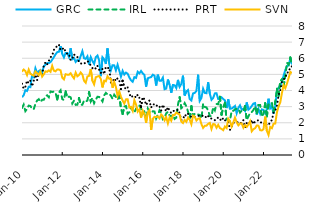
| Category | GRC | IRL | PRT | SVN |
|---|---|---|---|---|
| 2010-01-01 | 3.58 | 2.91 | 4.42 | 5.17 |
| 2010-02-01 | 3.71 | 3.12 | 4.11 | 5.3 |
| 2010-03-01 | 4.02 | 2.72 | 4.24 | 5.21 |
| 2010-04-01 | 3.97 | 2.85 | 4.61 | 4.96 |
| 2010-05-01 | 4.23 | 3.06 | 4.45 | 5.3 |
| 2010-06-01 | 4.21 | 3.04 | 4.61 | 5.04 |
| 2010-07-01 | 4.94 | 2.86 | 4.26 | 4.97 |
| 2010-08-01 | 4.83 | 2.84 | 4.59 | 4.92 |
| 2010-09-01 | 5.38 | 3.17 | 4.98 | 5.18 |
| 2010-10-01 | 5.09 | 3.38 | 4.64 | 5.07 |
| 2010-11-01 | 5.2 | 3.46 | 5.07 | 4.95 |
| 2010-12-01 | 5.27 | 3.29 | 5.12 | 5.18 |
| 2011-01-01 | 5.12 | 3.42 | 4.97 | 4.86 |
| 2011-02-01 | 5.5 | 3.43 | 5.54 | 5 |
| 2011-03-01 | 5.6 | 3.64 | 5.75 | 5.19 |
| 2011-04-01 | 5.7 | 3.7 | 5.61 | 5.16 |
| 2011-05-01 | 5.7 | 3.58 | 5.84 | 5.25 |
| 2011-06-01 | 5.76 | 3.94 | 6.06 | 5.16 |
| 2011-07-01 | 5.91 | 3.91 | 6.15 | 5.53 |
| 2011-08-01 | 6.07 | 3.93 | 6.51 | 5.23 |
| 2011-09-01 | 6.24 | 3.87 | 6.69 | 5.19 |
| 2011-10-01 | 6.38 | 3.44 | 6.73 | 5.3 |
| 2011-11-01 | 6.4 | 3.87 | 6.85 | 5.3 |
| 2011-12-01 | 6.75 | 4.01 | 6.5 | 5.25 |
| 2012-01-01 | 6.27 | 3.47 | 6.56 | 4.79 |
| 2012-02-01 | 6.05 | 3.41 | 6.65 | 4.69 |
| 2012-03-01 | 6.33 | 3.95 | 6.39 | 5.01 |
| 2012-04-01 | 6.32 | 3.56 | 6.27 | 4.98 |
| 2012-05-01 | 6.08 | 3.62 | 6.27 | 4.98 |
| 2012-06-01 | 6.62 | 3.58 | 5.88 | 5.07 |
| 2012-07-01 | 5.94 | 3.19 | 5.96 | 4.89 |
| 2012-08-01 | 6.02 | 3.37 | 6.24 | 4.75 |
| 2012-09-01 | 5.77 | 3.11 | 6.13 | 5.11 |
| 2012-10-01 | 5.89 | 3.12 | 6.09 | 4.88 |
| 2012-11-01 | 5.85 | 3.53 | 5.73 | 4.96 |
| 2012-12-01 | 6.14 | 3.11 | 5.69 | 5.12 |
| 2013-01-01 | 6.44 | 3.12 | 5.63 | 4.99 |
| 2013-02-01 | 6 | 3.37 | 5.68 | 4.6 |
| 2013-03-01 | 5.96 | 3.31 | 5.72 | 4.48 |
| 2013-04-01 | 6.12 | 3.38 | 5.82 | 4.87 |
| 2013-05-01 | 5.61 | 3.9 | 5.74 | 4.91 |
| 2013-06-01 | 6.07 | 3.33 | 5.53 | 5.32 |
| 2013-07-01 | 5.83 | 3.54 | 5.39 | 4.6 |
| 2013-08-01 | 5.65 | 3.21 | 5.46 | 4.38 |
| 2013-09-01 | 6.07 | 3.44 | 5.35 | 4.82 |
| 2013-10-01 | 6.17 | 3.61 | 5.53 | 4.87 |
| 2013-11-01 | 5.87 | 3.6 | 5.29 | 4.9 |
| 2013-12-01 | 4.89 | 3.47 | 5.08 | 4.72 |
| 2014-01-01 | 6.06 | 3.32 | 5.34 | 4.19 |
| 2014-02-01 | 5.93 | 3.7 | 5.01 | 4.61 |
| 2014-03-01 | 5.65 | 3.85 | 5.46 | 4.57 |
| 2014-04-01 | 6.61 | 3.76 | 5.38 | 4.88 |
| 2014-05-01 | 5.66 | 3.79 | 5.42 | 4.73 |
| 2014-06-01 | 5.25 | 3.68 | 4.49 | 4.72 |
| 2014-07-01 | 5.57 | 3.48 | 4.52 | 4.17 |
| 2014-08-01 | 5.56 | 3.74 | 4.76 | 4.53 |
| 2014-09-01 | 5.25 | 3.6 | 4.59 | 4.22 |
| 2014-10-01 | 5.6 | 3.43 | 4.76 | 3.66 |
| 2014-11-01 | 5.24 | 3.77 | 4.63 | 3.95 |
| 2014-12-01 | 4.86 | 2.89 | 4.09 | 3.61 |
| 2015-01-01 | 5.22 | 2.54 | 4.61 | 3.38 |
| 2015-02-01 | 4.99 | 3.01 | 4.22 | 3.19 |
| 2015-03-01 | 5.11 | 3.04 | 4.07 | 3.45 |
| 2015-04-01 | 5.04 | 2.55 | 4.19 | 3.46 |
| 2015-05-01 | 4.81 | 2.65 | 3.82 | 2.95 |
| 2015-06-01 | 4.63 | 2.93 | 3.57 | 2.98 |
| 2015-07-01 | 4.54 | 2.77 | 3.66 | 2.74 |
| 2015-08-01 | 4.83 | 2.63 | 3.68 | 3.4 |
| 2015-09-01 | 4.78 | 2.87 | 3.55 | 3.13 |
| 2015-10-01 | 5.16 | 2.89 | 3.74 | 2.69 |
| 2015-11-01 | 5.06 | 3.07 | 3.54 | 2.83 |
| 2015-12-01 | 5.21 | 2.84 | 2.98 | 2.32 |
| 2016-01-01 | 5.06 | 2.55 | 3.59 | 2.75 |
| 2016-02-01 | 4.97 | 2.68 | 3.45 | 2.53 |
| 2016-03-01 | 4.24 | 2.41 | 3.1 | 2 |
| 2016-04-01 | 4.76 | 2.88 | 3.26 | 2.64 |
| 2016-05-01 | 4.8 | 2.67 | 3.38 | 2.78 |
| 2016-06-01 | 4.83 | 2.6 | 2.94 | 1.55 |
| 2016-07-01 | 4.98 | 2.71 | 3.14 | 2.25 |
| 2016-08-01 | 4.92 | 2.7 | 3.14 | 2.37 |
| 2016-09-01 | 4.31 | 2.27 | 3.03 | 2.35 |
| 2016-10-01 | 4.98 | 2.5 | 3.11 | 2.39 |
| 2016-11-01 | 4.61 | 2.77 | 3.01 | 2.27 |
| 2016-12-01 | 4.61 | 2.6 | 2.76 | 2.51 |
| 2017-01-01 | 4.8 | 2.22 | 3.12 | 2.4 |
| 2017-02-01 | 4.08 | 2.31 | 2.89 | 2.15 |
| 2017-03-01 | 4.12 | 2.58 | 2.71 | 2.35 |
| 2017-04-01 | 4.68 | 2.68 | 2.97 | 1.96 |
| 2017-05-01 | 4.36 | 2.45 | 2.74 | 2.33 |
| 2017-06-01 | 3.86 | 2.39 | 2.6 | 2.13 |
| 2017-07-01 | 4.34 | 2.49 | 2.72 | 2.48 |
| 2017-08-01 | 4.33 | 2.24 | 2.75 | 2.48 |
| 2017-09-01 | 4.15 | 2.32 | 2.74 | 2.63 |
| 2017-10-01 | 4.66 | 3.13 | 2.82 | 2.56 |
| 2017-11-01 | 4.23 | 3.58 | 2.58 | 2.5 |
| 2017-12-01 | 4.41 | 2.91 | 2.16 | 2.07 |
| 2018-01-01 | 4.92 | 3.01 | 2.21 | 1.98 |
| 2018-02-01 | 3.69 | 3.22 | 2.51 | 2.18 |
| 2018-03-01 | 3.94 | 3.01 | 2.41 | 2.06 |
| 2018-04-01 | 4.03 | 2.69 | 2.55 | 2.32 |
| 2018-05-01 | 3.47 | 2.3 | 2.47 | 2.19 |
| 2018-06-01 | 3.38 | 3.02 | 2.36 | 1.91 |
| 2018-07-01 | 3.82 | 2.43 | 2.37 | 2.44 |
| 2018-08-01 | 3.85 | 2.55 | 2.36 | 2.38 |
| 2018-09-01 | 3.97 | 2.48 | 2.36 | 2.14 |
| 2018-10-01 | 4.98 | 2.51 | 2.43 | 2.25 |
| 2018-11-01 | 3.36 | 2.48 | 2.43 | 2.28 |
| 2018-12-01 | 3.54 | 2.26 | 2.46 | 1.91 |
| 2019-01-01 | 4.11 | 3.18 | 2.41 | 1.68 |
| 2019-02-01 | 3.85 | 2.98 | 2.43 | 1.81 |
| 2019-03-01 | 3.83 | 2.95 | 2.29 | 1.82 |
| 2019-04-01 | 4.51 | 2.76 | 2.41 | 1.93 |
| 2019-05-01 | 3.8 | 2.42 | 2.27 | 1.99 |
| 2019-06-01 | 3.42 | 2.41 | 2.26 | 1.61 |
| 2019-07-01 | 3.54 | 2.96 | 2.23 | 1.92 |
| 2019-08-01 | 3.82 | 2.77 | 2.16 | 1.9 |
| 2019-09-01 | 3.83 | 3.16 | 2.19 | 1.69 |
| 2019-10-01 | 3.47 | 3.15 | 2.34 | 1.87 |
| 2019-11-01 | 3.46 | 3.61 | 2.22 | 1.67 |
| 2019-12-01 | 3.58 | 2.5 | 2.12 | 1.62 |
| 2020-01-01 | 3.47 | 2.97 | 2.3 | 1.54 |
| 2020-02-01 | 3.39 | 3.24 | 2.15 | 1.77 |
| 2020-03-01 | 2.91 | 2.22 | 2.12 | 1.67 |
| 2020-04-01 | 3.45 | 2.12 | 2.08 | 2.25 |
| 2020-05-01 | 2.87 | 2.12 | 1.56 | 2.1 |
| 2020-06-01 | 2.88 | 2.73 | 1.75 | 1.76 |
| 2020-07-01 | 2.95 | 2.74 | 2 | 2.02 |
| 2020-08-01 | 3.04 | 2.83 | 1.98 | 2.32 |
| 2020-09-01 | 2.59 | 2.87 | 2 | 2.03 |
| 2020-10-01 | 2.92 | 2.87 | 2.07 | 1.84 |
| 2020-11-01 | 3.08 | 2.63 | 1.99 | 1.95 |
| 2020-12-01 | 2.81 | 2.74 | 1.99 | 1.96 |
| 2021-01-01 | 2.87 | 2.69 | 2.16 | 1.69 |
| 2021-02-01 | 2.73 | 3.04 | 1.71 | 1.86 |
| 2021-03-01 | 3.26 | 2.17 | 1.98 | 1.74 |
| 2021-04-01 | 2.81 | 2.39 | 2.07 | 1.89 |
| 2021-05-01 | 2.9 | 2.62 | 1.93 | 2.09 |
| 2021-06-01 | 3.04 | 2.66 | 2.17 | 1.47 |
| 2021-07-01 | 3.19 | 2.79 | 1.91 | 1.6 |
| 2021-08-01 | 3.22 | 3.02 | 2.08 | 1.66 |
| 2021-09-01 | 2.51 | 2.59 | 2.14 | 1.83 |
| 2021-10-01 | 2.85 | 3.1 | 2.15 | 1.82 |
| 2021-11-01 | 2.56 | 3.1 | 2.04 | 1.54 |
| 2021-12-01 | 2.83 | 2.37 | 2 | 1.52 |
| 2022-01-01 | 2.8 | 2.56 | 1.9 | 1.6 |
| 2022-02-01 | 2.6 | 3.21 | 2.02 | 2.38 |
| 2022-03-01 | 2.84 | 2.39 | 1.86 | 1.5 |
| 2022-04-01 | 3.49 | 3.16 | 1.85 | 1.24 |
| 2022-05-01 | 2.89 | 3.19 | 2.06 | 1.74 |
| 2022-06-01 | 3.01 | 3.22 | 2.16 | 1.66 |
| 2022-07-01 | 2.57 | 2.67 | 2.63 | 1.94 |
| 2022-08-01 | 3 | 3.3 | 2.73 | 1.95 |
| 2022-09-01 | 3.97 | 4.11 | 3.03 | 2.64 |
| 2022-10-01 | 4.17 | 3.66 | 3.72 | 3.02 |
| 2022-11-01 | 4.3 | 4.58 | 4.01 | 3.26 |
| 2022-12-01 | 4.54 | 4.7 | 4.54 | 3.85 |
| 2023-01-01 | 4.92 | 4.27 | 4.7 | 4.33 |
| 2023-02-01 | 5.27 | 4.9 | 4.76 | 4.14 |
| 2023-03-01 | 5.51 | 5.72 | 5.11 | 4.43 |
| 2023-04-01 | 5.56 | 5.6 | 5.13 | 4.78 |
| 2023-05-01 | 5.99 | 6.05 | 5.45 | 5.15 |
| 2023-06-01 | 5.63 | 5.57 | 5.5 | 5.08 |